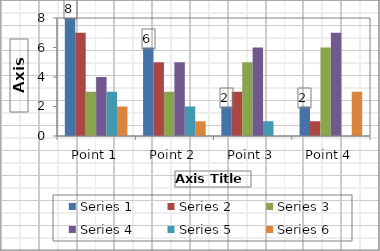
| Category | Series 1 | Series 2 | Series 3 | Series 4 | Series 5 | Series 6 |
|---|---|---|---|---|---|---|
| Point 1 | 8 | 7 | 3 | 4 | 3 | 2 |
| Point 2 | 6 | 5 | 3 | 5 | 2 | 1 |
| Point 3 | 2 | 3 | 5 | 6 | 1 | 0 |
| Point 4 | 2 | 1 | 6 | 7 | 0 | 3 |